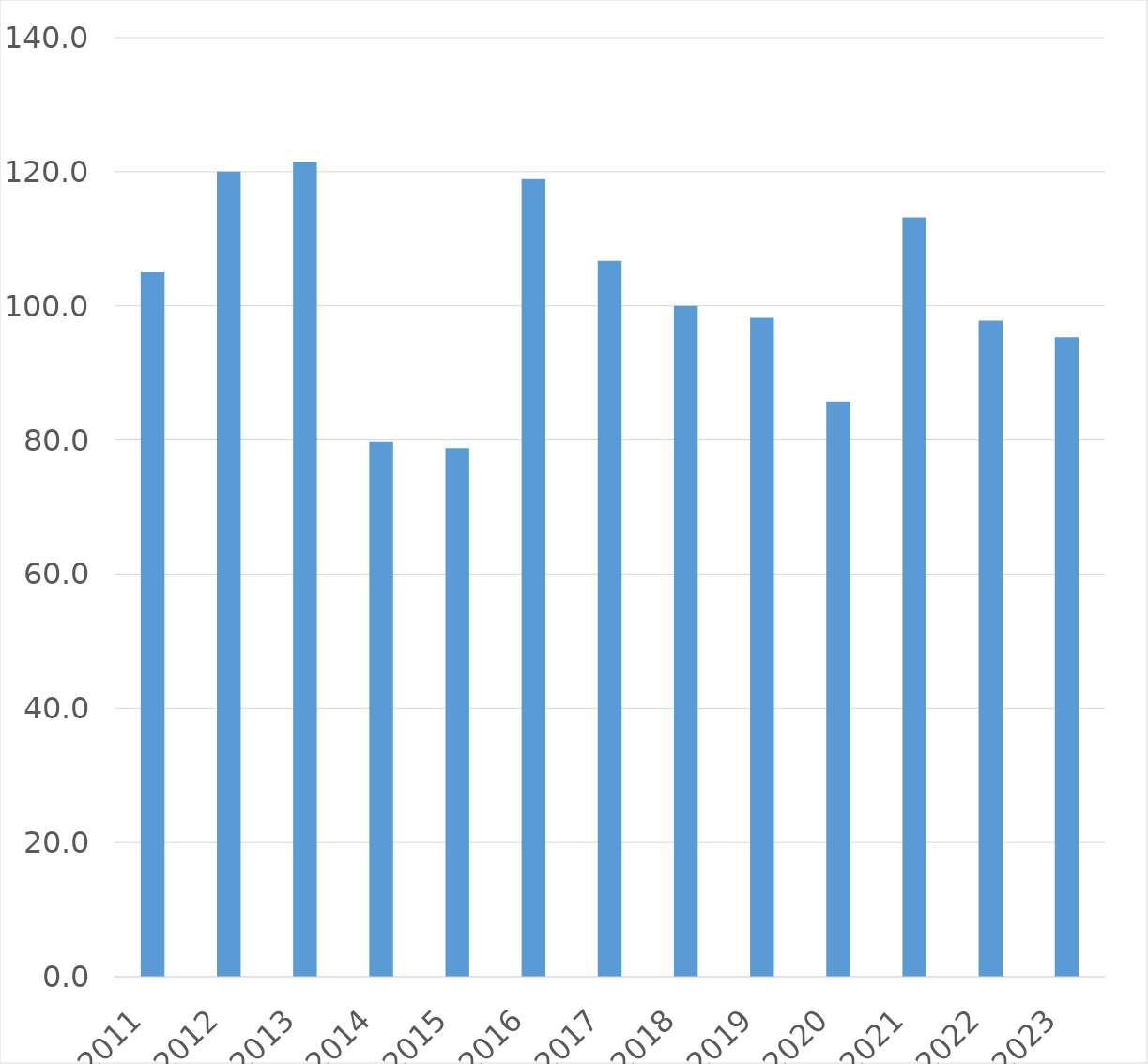
| Category | Series 0 |
|---|---|
| 2011 | 105 |
| 2012 | 120 |
| 2013 | 121.4 |
| 2014 | 79.7 |
| 2015 | 78.8 |
| 2016 | 118.9 |
| 2017 | 106.7 |
| 2018 | 100 |
| 2019 | 98.2 |
| 2020 | 85.7 |
| 2021 | 113.2 |
| 2022 | 97.8 |
| 2023 | 95.3 |